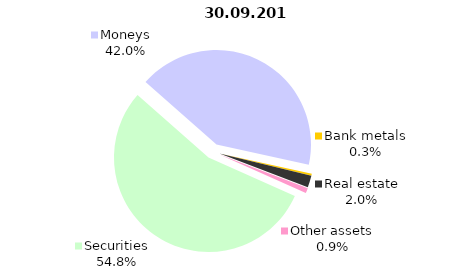
| Category | Total |
|---|---|
| Securities | 849.749 |
| Moneys | 650.537 |
| Bank metals | 5.006 |
| Real estate | 31.489 |
| Other assets | 13.492 |